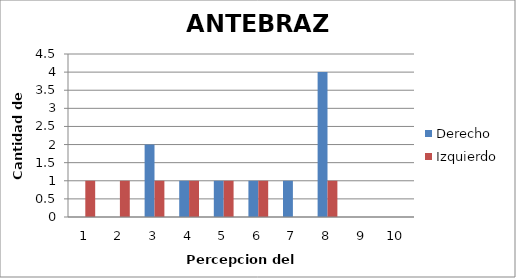
| Category | Derecho  | Izquierdo |
|---|---|---|
| 0 | 0 | 1 |
| 1 | 0 | 1 |
| 2 | 2 | 1 |
| 3 | 1 | 1 |
| 4 | 1 | 1 |
| 5 | 1 | 1 |
| 6 | 1 | 0 |
| 7 | 4 | 1 |
| 8 | 0 | 0 |
| 9 | 0 | 0 |